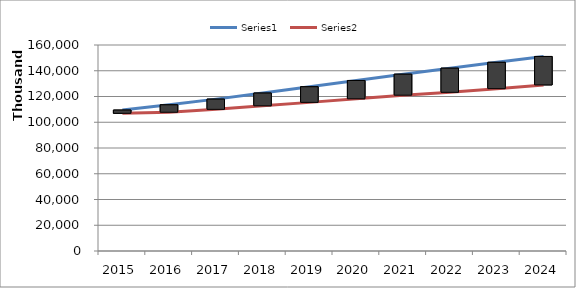
| Category | Series 0 | Series 1 |
|---|---|---|
| 2015.0 | 109487600 | 106936223 |
| 2016.0 | 113538641 | 107765643 |
| 2017.0 | 117966648 | 110014972 |
| 2018.0 | 122685314 | 112748977 |
| 2019.0 | 127592727 | 115439238 |
| 2020.0 | 132441251 | 118194065 |
| 2021.0 | 137341577 | 121015008 |
| 2022.0 | 142011191 | 123248892 |
| 2023.0 | 146555549 | 126083617 |
| 2024.0 | 151098771 | 128983540 |